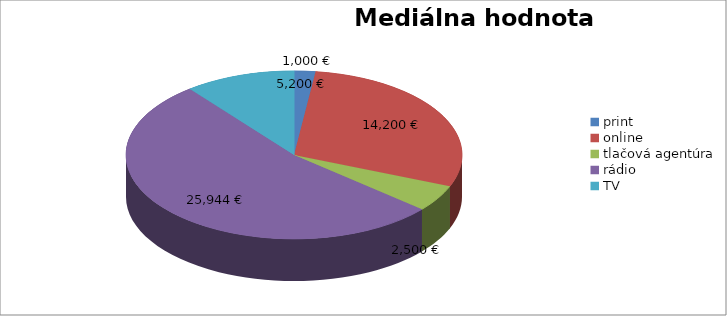
| Category | Mediálna hodnota výstupov |
|---|---|
| print | 1000 |
| online | 14200 |
| tlačová agentúra | 2500 |
| rádio | 25944 |
| TV | 5200 |